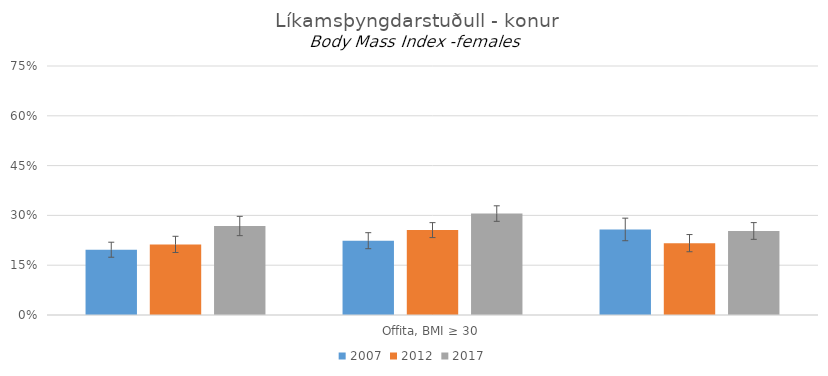
| Category | 2007 | 2012 | 2017 |
|---|---|---|---|
| 0 | 0.197 | 0.213 | 0.268 |
| 1 | 0.224 | 0.256 | 0.306 |
| 2 | 0.258 | 0.216 | 0.253 |